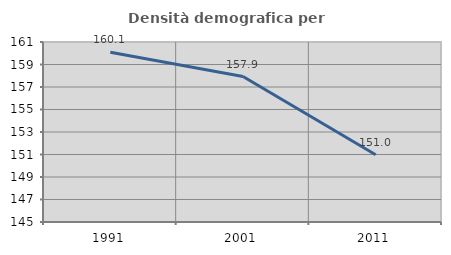
| Category | Densità demografica |
|---|---|
| 1991.0 | 160.095 |
| 2001.0 | 157.929 |
| 2011.0 | 150.975 |